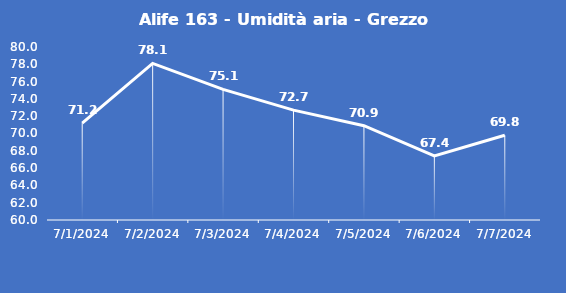
| Category | Alife 163 - Umidità aria - Grezzo (%) |
|---|---|
| 7/1/24 | 71.2 |
| 7/2/24 | 78.1 |
| 7/3/24 | 75.1 |
| 7/4/24 | 72.7 |
| 7/5/24 | 70.9 |
| 7/6/24 | 67.4 |
| 7/7/24 | 69.8 |